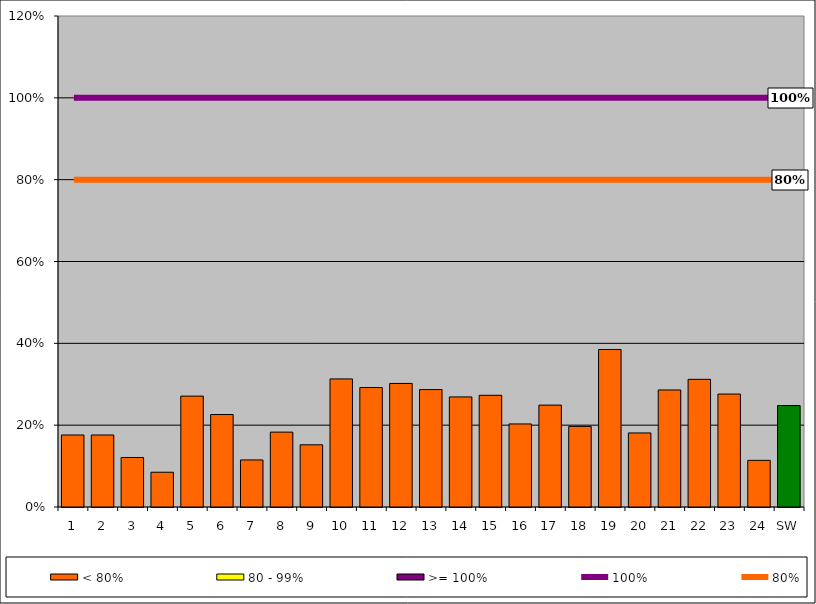
| Category | < 80% | 80 - 99% | >= 100% |
|---|---|---|---|
| 1 | 0.176 | 0 | 0 |
| 2 | 0.176 | 0 | 0 |
| 3 | 0.121 | 0 | 0 |
| 4 | 0.085 | 0 | 0 |
| 5 | 0.271 | 0 | 0 |
| 6 | 0.226 | 0 | 0 |
| 7 | 0.115 | 0 | 0 |
| 8 | 0.183 | 0 | 0 |
| 9 | 0.152 | 0 | 0 |
| 10 | 0.313 | 0 | 0 |
| 11 | 0.292 | 0 | 0 |
| 12 | 0.302 | 0 | 0 |
| 13 | 0.287 | 0 | 0 |
| 14 | 0.269 | 0 | 0 |
| 15 | 0.273 | 0 | 0 |
| 16 | 0.203 | 0 | 0 |
| 17 | 0.249 | 0 | 0 |
| 18 | 0.197 | 0 | 0 |
| 19 | 0.385 | 0 | 0 |
| 20 | 0.181 | 0 | 0 |
| 21 | 0.286 | 0 | 0 |
| 22 | 0.312 | 0 | 0 |
| 23 | 0.276 | 0 | 0 |
| 24 | 0.114 | 0 | 0 |
| SW | 0.248 | 0 | 0 |